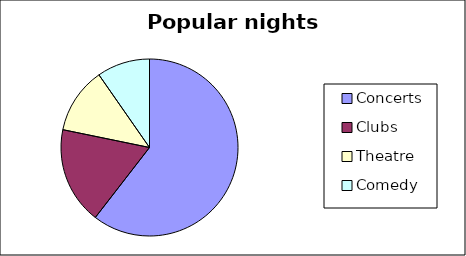
| Category | people |
|---|---|
| Concerts | 75 |
| Clubs | 22 |
| Theatre | 15 |
| Comedy | 12 |